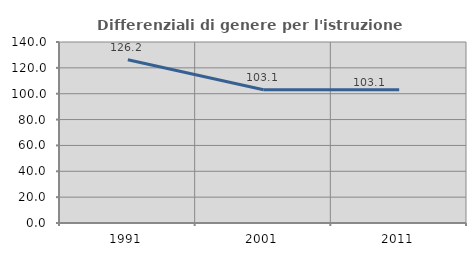
| Category | Differenziali di genere per l'istruzione superiore |
|---|---|
| 1991.0 | 126.248 |
| 2001.0 | 103.108 |
| 2011.0 | 103.096 |